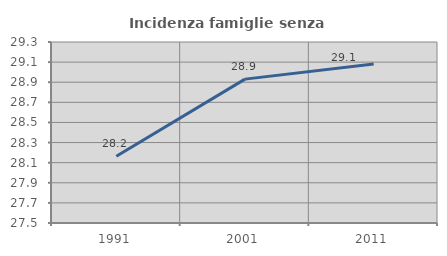
| Category | Incidenza famiglie senza nuclei |
|---|---|
| 1991.0 | 28.163 |
| 2001.0 | 28.931 |
| 2011.0 | 29.08 |